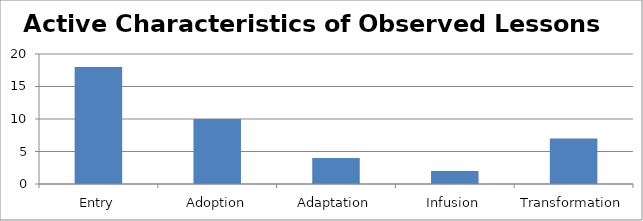
| Category | Active |
|---|---|
| Entry | 18 |
| Adoption | 10 |
| Adaptation | 4 |
| Infusion | 2 |
| Transformation | 7 |